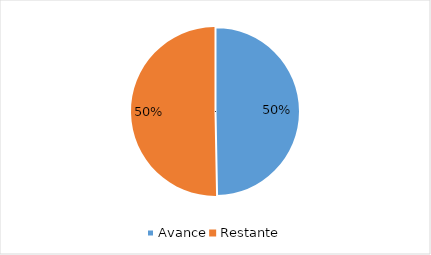
| Category | Series 0 |
|---|---|
| Avance | 0.497 |
| Restante | 0.503 |